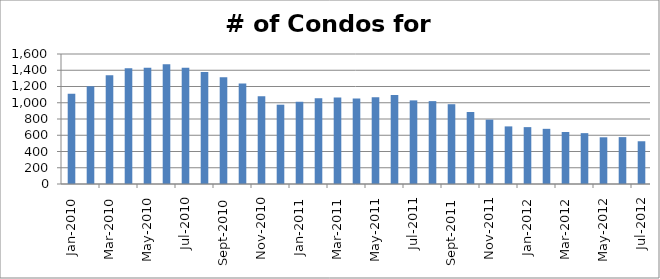
| Category | Series 0 |
|---|---|
| 2010-01-01 | 1111 |
| 2010-02-01 | 1203 |
| 2010-03-01 | 1337 |
| 2010-04-01 | 1425 |
| 2010-05-01 | 1431 |
| 2010-06-01 | 1475 |
| 2010-07-01 | 1432 |
| 2010-08-01 | 1380 |
| 2010-09-01 | 1314 |
| 2010-10-01 | 1236 |
| 2010-11-01 | 1081 |
| 2010-12-01 | 976 |
| 2011-01-01 | 1012 |
| 2011-02-01 | 1054 |
| 2011-03-01 | 1064 |
| 2011-04-01 | 1053 |
| 2011-05-01 | 1068 |
| 2011-06-01 | 1096 |
| 2011-07-01 | 1029 |
| 2011-08-01 | 1020 |
| 2011-09-01 | 982 |
| 2011-10-01 | 886 |
| 2011-11-01 | 792 |
| 2011-12-01 | 709 |
| 2012-01-01 | 700 |
| 2012-02-01 | 679 |
| 2012-03-01 | 640 |
| 2012-04-01 | 626 |
| 2012-05-01 | 575 |
| 2012-06-01 | 577 |
| 2012-07-01 | 526 |